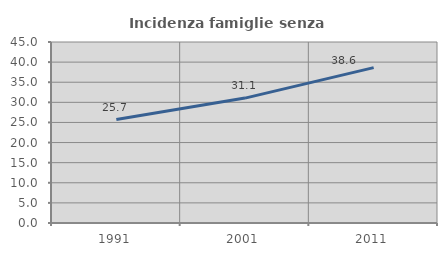
| Category | Incidenza famiglie senza nuclei |
|---|---|
| 1991.0 | 25.727 |
| 2001.0 | 31.054 |
| 2011.0 | 38.636 |